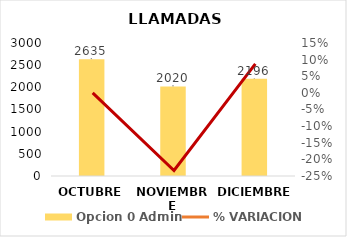
| Category | Opcion 0 Admin |
|---|---|
| OCTUBRE | 2635 |
| NOVIEMBRE | 2020 |
| DICIEMBRE | 2196 |